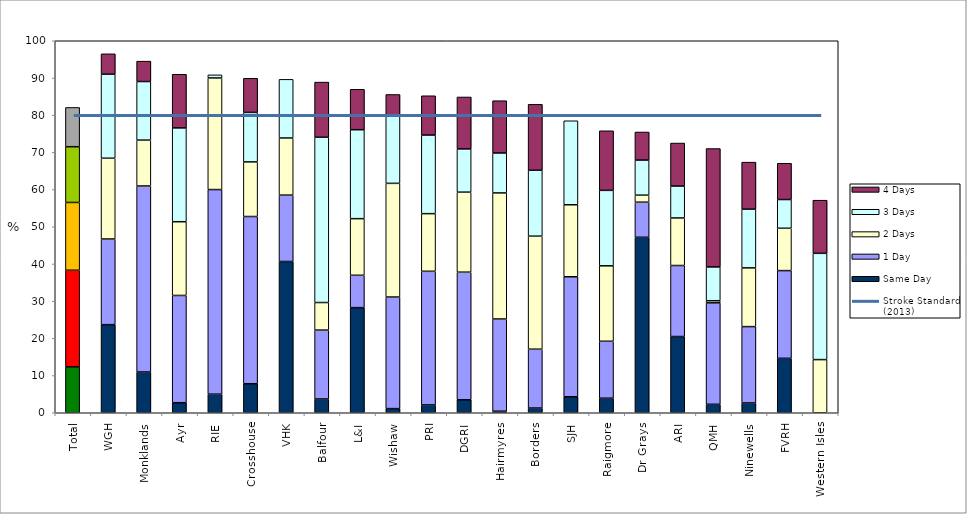
| Category | Same Day | 1 Day | 2 Days | 3 Days | 4 Days |
|---|---|---|---|---|---|
| Total | 12.332 | 25.98 | 18.215 | 14.99 | 10.552 |
| WGH | 23.684 | 23.026 | 21.711 | 22.588 | 5.482 |
| Monklands | 10.959 | 50 | 12.329 | 15.753 | 5.479 |
| Ayr | 2.703 | 28.829 | 19.82 | 25.225 | 14.414 |
| RIE | 5 | 55 | 30 | 0.833 | 0 |
| Crosshouse | 7.798 | 44.954 | 14.679 | 13.303 | 9.174 |
| VHK | 40.664 | 17.842 | 15.353 | 15.768 | 0 |
| Balfour | 3.704 | 18.519 | 7.407 | 44.444 | 14.815 |
| L&I | 28.261 | 8.696 | 15.217 | 23.913 | 10.87 |
| Wishaw | 1.111 | 30 | 30.556 | 18.333 | 5.556 |
| PRI | 2.113 | 35.915 | 15.493 | 21.127 | 10.563 |
| DGRI | 3.488 | 34.302 | 21.512 | 11.628 | 13.953 |
| Hairmyres | 0.413 | 24.793 | 33.884 | 10.744 | 14.05 |
| Borders | 1.266 | 15.823 | 30.38 | 17.722 | 17.722 |
| SJH | 4.301 | 32.258 | 19.355 | 22.581 | 0 |
| Raigmore | 3.915 | 15.302 | 20.285 | 20.285 | 16.014 |
| Dr Grays | 47.17 | 9.434 | 1.887 | 9.434 | 7.547 |
| ARI | 20.49 | 19.089 | 12.785 | 8.581 | 11.559 |
| QMH | 2.273 | 27.273 | 0.568 | 9.091 | 31.818 |
| Ninewells | 2.632 | 20.526 | 15.789 | 15.789 | 12.632 |
| FVRH | 14.634 | 23.577 | 11.382 | 7.724 | 9.756 |
| Western Isles | 0 | 0 | 14.286 | 28.571 | 14.286 |